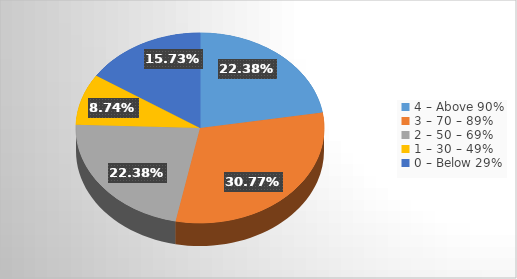
| Category | Series 0 |
|---|---|
| 4 – Above 90%  | 0.224 |
| 3 – 70 – 89%  | 0.308 |
| 2 – 50 – 69%  | 0.224 |
| 1 – 30 – 49%   | 0.087 |
| 0 – Below 29% | 0.157 |